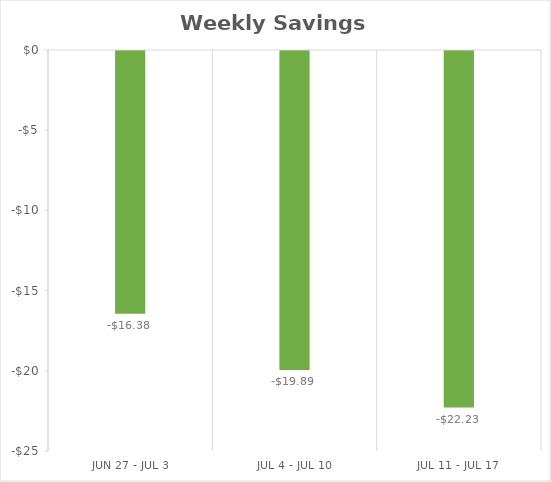
| Category | Weekly Savings ($) |
|---|---|
| Jun 27 - Jul 3 | -16.38 |
| Jul 4 - Jul 10 | -19.89 |
| Jul 11 - Jul 17 | -22.23 |